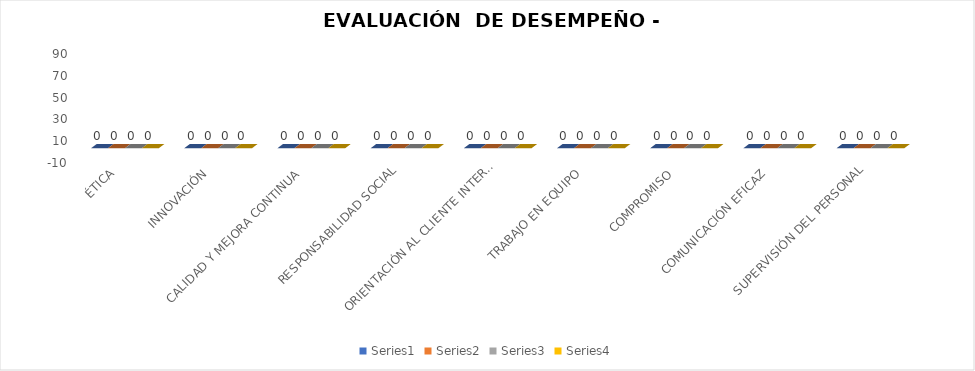
| Category | Series 0 | Series 1 | Series 2 | Series 3 |
|---|---|---|---|---|
| ÉTICA  | 0 | 0 | 0 | 0 |
| INNOVACIÓN  | 0 | 0 | 0 | 0 |
| CALIDAD Y MEJORA CONTINUA  | 0 | 0 | 0 | 0 |
| RESPONSABILIDAD SOCIAL | 0 | 0 | 0 | 0 |
| ORIENTACIÓN AL CLIENTE INTERNO Y EXTERNO | 0 | 0 | 0 | 0 |
| TRABAJO EN EQUIPO  | 0 | 0 | 0 | 0 |
| COMPROMISO  | 0 | 0 | 0 | 0 |
| COMUNICACIÓN EFICAZ  | 0 | 0 | 0 | 0 |
| SUPERVISIÓN DEL PERSONAL | 0 | 0 | 0 | 0 |